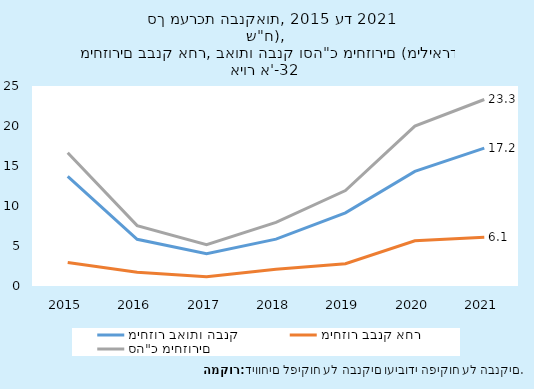
| Category | מיחזור באותו הבנק | מיחזור בבנק אחר | סה"כ מיחזורים |
|---|---|---|---|
| 2015.0 | 13.7 | 2.95 | 16.649 |
| 2016.0 | 5.845 | 1.707 | 7.552 |
| 2017.0 | 4.025 | 1.144 | 5.168 |
| 2018.0 | 5.854 | 2.094 | 7.948 |
| 2019.0 | 9.144 | 2.783 | 11.927 |
| 2020.0 | 14.326 | 5.659 | 19.985 |
| 2021.0 | 17.225 | 6.089 | 23.314 |